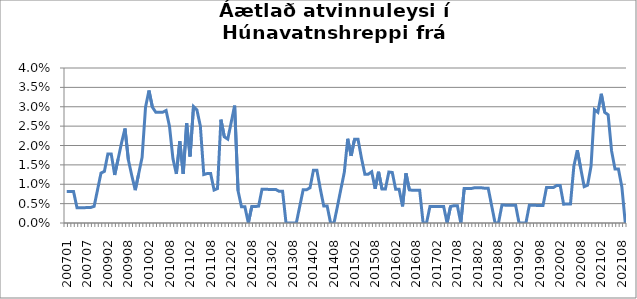
| Category | Series 0 |
|---|---|
| 200701 | 0.008 |
| 200702 | 0.008 |
| 200703 | 0.008 |
| 200704 | 0.004 |
| 200705 | 0.004 |
| 200706 | 0.004 |
| 200707 | 0.004 |
| 200708 | 0.004 |
| 200810 | 0.004 |
| 200811 | 0.009 |
| 200812 | 0.013 |
| 200901 | 0.013 |
| 200902 | 0.018 |
| 200903 | 0.018 |
| 200904 | 0.012 |
| 200905 | 0.017 |
| 200906 | 0.021 |
| 200907 | 0.024 |
| 200908 | 0.016 |
| 200909 | 0.012 |
| 200910 | 0.008 |
| 200911 | 0.013 |
| 200912 | 0.017 |
| 201001 | 0.03 |
| 201002 | 0.034 |
| 201003 | 0.03 |
| 201004 | 0.029 |
| 201005 | 0.029 |
| 201006 | 0.029 |
| 201007 | 0.029 |
| 201008 | 0.025 |
| 201009 | 0.017 |
| 201010 | 0.013 |
| 201011 | 0.021 |
| 201012 | 0.013 |
| 201101 | 0.026 |
| 201102 | 0.017 |
| 201103 | 0.03 |
| 201104 | 0.029 |
| 201105 | 0.025 |
| 201106 | 0.012 |
| 201107 | 0.013 |
| 201108 | 0.013 |
| 201109 | 0.009 |
| 201110 | 0.009 |
| 201111 | 0.027 |
| 201112 | 0.022 |
| 201201 | 0.022 |
| 201202 | 0.026 |
| 201203 | 0.03 |
| 201204 | 0.008 |
| 201205 | 0.004 |
| 201206 | 0.004 |
| 201207 | 0 |
| 201208 | 0.004 |
| 201209 | 0.004 |
| 201210 | 0.004 |
| 201211 | 0.009 |
| 201212 | 0.009 |
| 201301 | 0.009 |
| 201302 | 0.009 |
| 201303 | 0.009 |
| 201304 | 0.008 |
| 201305 | 0.008 |
| 201306 | 0 |
| 201307 | 0 |
| 201308 | 0 |
| 201309 | 0 |
| 201310 | 0.004 |
| 201311 | 0.009 |
| 201312 | 0.009 |
| 201401 | 0.009 |
| 201402 | 0.014 |
| 201403 | 0.014 |
| 201404 | 0.009 |
| 201405 | 0.004 |
| 201406 | 0.004 |
| 201407 | 0 |
| 201408 | 0 |
| 201409 | 0.004 |
| 201410 | 0.009 |
| 201411 | 0.013 |
| 201412 | 0.022 |
| 201501 | 0.017 |
| 201502 | 0.022 |
| 201503 | 0.022 |
| 201504 | 0.017 |
| 201505 | 0.013 |
| 201506 | 0.013 |
| 201507 | 0.013 |
| 201508 | 0.009 |
| 201509 | 0.013 |
| 201510 | 0.009 |
| 201511 | 0.009 |
| 201512 | 0.013 |
| 201601 | 0.013 |
| 201602 | 0.009 |
| 201603 | 0.009 |
| 201604 | 0.004 |
| 201605 | 0.013 |
| 201606 | 0.009 |
| 201607 | 0.008 |
| 201608 | 0.008 |
| 201609 | 0.008 |
| 201610 | 0 |
| 201611 | 0 |
| 201612 | 0.004 |
| 201701 | 0.004 |
| 201702 | 0.004 |
| 201703 | 0.004 |
| 201704 | 0.004 |
| 201705 | 0 |
| 201706 | 0.004 |
| 201707 | 0.004 |
| 201708 | 0.004 |
| 201709 | 0 |
| 201710 | 0.009 |
| 201711 | 0.009 |
| 201712 | 0.009 |
| 201801 | 0.009 |
| 201802 | 0.009 |
| 201803 | 0.009 |
| 201804 | 0.009 |
| 201805 | 0.009 |
| 201806 | 0.004 |
| 201807 | 0 |
| 201808 | 0 |
| 201809 | 0.005 |
| 201810 | 0.005 |
| 201811 | 0.005 |
| 201812 | 0.005 |
| 201901 | 0.005 |
| 201902 | 0 |
| 201903 | 0 |
| 201904 | 0 |
| 201905 | 0.005 |
| 201906 | 0.005 |
| 201907 | 0.005 |
| 201908 | 0.005 |
| 201909 | 0.005 |
| 201910 | 0.009 |
| 201911 | 0.009 |
| 201912 | 0.009 |
| 202001 | 0.01 |
| 202002 | 0.01 |
| 202003 | 0.005 |
| 202004 | 0.005 |
| 202005 | 0.005 |
| 202006 | 0.015 |
| 202007 | 0.019 |
| 202008 | 0.014 |
| 202009 | 0.009 |
| 202010 | 0.01 |
| 202011 | 0.015 |
| 202012 | 0.029 |
| 202101 | 0.029 |
| 202102 | 0.033 |
| 202103 | 0.029 |
| 202104 | 0.028 |
| 202105 | 0.019 |
| 202106 | 0.014 |
| 202107 | 0.014 |
| 202108 | 0.009 |
| 202109 | 0 |